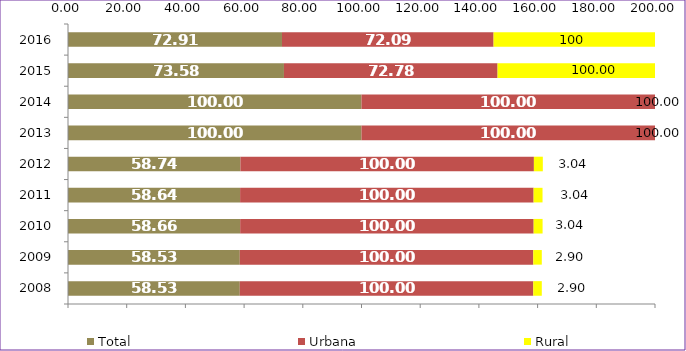
| Category | Total | Urbana | Rural |
|---|---|---|---|
| 2008.0 | 58.53 | 100 | 2.9 |
| 2009.0 | 58.53 | 100 | 2.9 |
| 2010.0 | 58.66 | 100 | 3.04 |
| 2011.0 | 58.64 | 100 | 3.04 |
| 2012.0 | 58.74 | 100 | 3.04 |
| 2013.0 | 100 | 100 | 100 |
| 2014.0 | 100 | 100 | 100 |
| 2015.0 | 73.58 | 72.78 | 100 |
| 2016.0 | 72.91 | 72.09 | 100 |